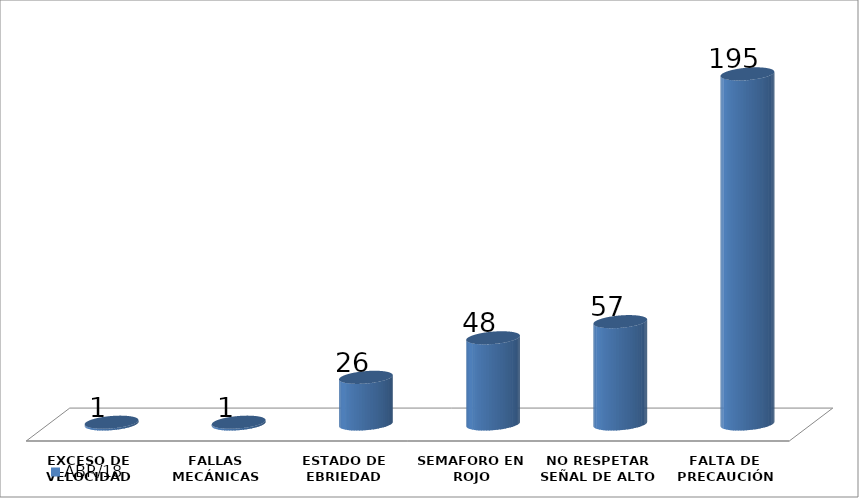
| Category | ABR/18 |
|---|---|
| EXCESO DE VELOCIDAD | 1 |
| FALLAS MECÁNICAS | 1 |
| ESTADO DE EBRIEDAD | 26 |
| SEMAFORO EN ROJO | 48 |
| NO RESPETAR SEÑAL DE ALTO | 57 |
| FALTA DE PRECAUCIÓN | 195 |